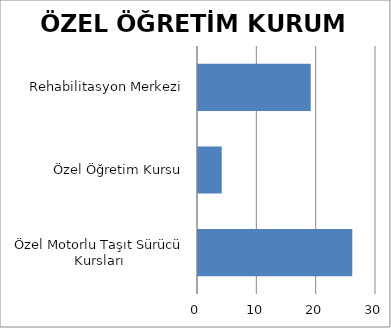
| Category | ÖZEL YAYGIN EĞİTİM KURUM SAYISI |
|---|---|
| Özel Motorlu Taşıt Sürücü Kursları | 26 |
| Özel Öğretim Kursu | 4 |
| Rehabilitasyon Merkezi | 19 |